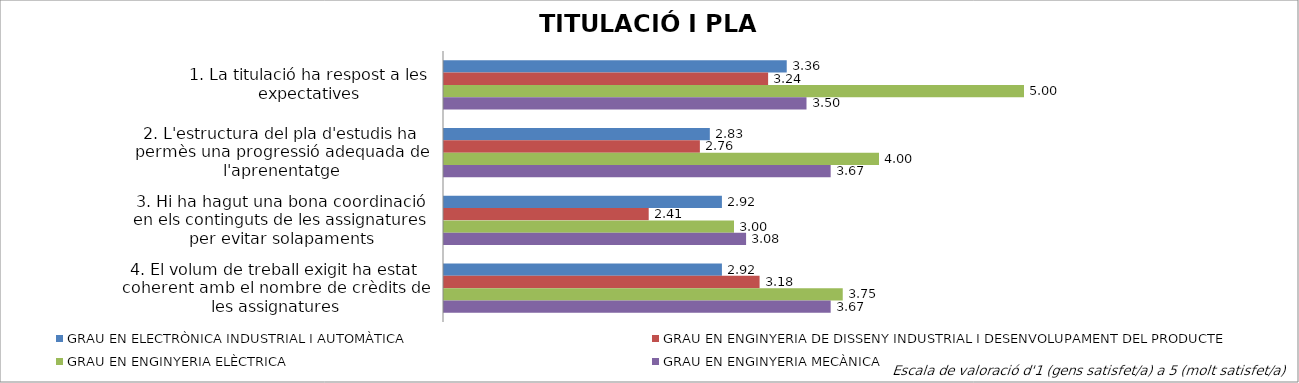
| Category | GRAU EN ELECTRÒNICA INDUSTRIAL I AUTOMÀTICA | GRAU EN ENGINYERIA DE DISSENY INDUSTRIAL I DESENVOLUPAMENT DEL PRODUCTE | GRAU EN ENGINYERIA ELÈCTRICA | GRAU EN ENGINYERIA MECÀNICA |
|---|---|---|---|---|
| 1. La titulació ha respost a les expectatives | 3.364 | 3.235 | 5 | 3.5 |
| 2. L'estructura del pla d'estudis ha permès una progressió adequada de l'aprenentatge | 2.833 | 2.765 | 4 | 3.667 |
| 3. Hi ha hagut una bona coordinació en els continguts de les assignatures per evitar solapaments | 2.917 | 2.412 | 3 | 3.083 |
| 4. El volum de treball exigit ha estat coherent amb el nombre de crèdits de les assignatures | 2.917 | 3.176 | 3.75 | 3.667 |